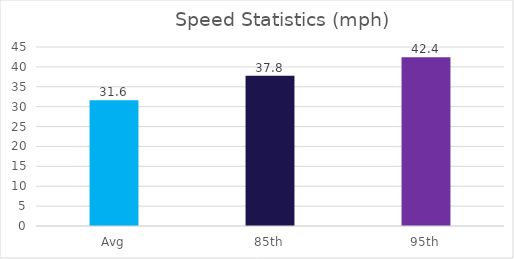
| Category | Series 0 |
|---|---|
| Avg | 31.6 |
| 85th | 37.8 |
| 95th | 42.4 |